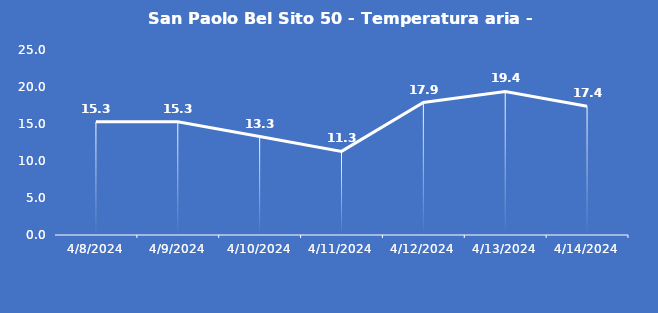
| Category | San Paolo Bel Sito 50 - Temperatura aria - Grezzo (°C) |
|---|---|
| 4/8/24 | 15.3 |
| 4/9/24 | 15.3 |
| 4/10/24 | 13.3 |
| 4/11/24 | 11.3 |
| 4/12/24 | 17.9 |
| 4/13/24 | 19.4 |
| 4/14/24 | 17.4 |